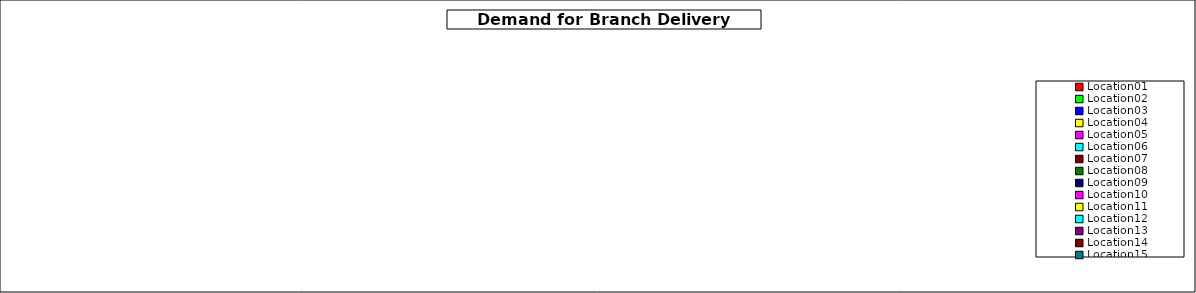
| Category | Data A |
|---|---|
| Location01 | 0 |
| Location02 | 0 |
| Location03 | 0 |
| Location04 | 0 |
| Location05 | 0 |
| Location06 | 0 |
| Location07 | 0 |
| Location08 | 0 |
| Location09 | 0 |
| Location10 | 0 |
| Location11 | 0 |
| Location12 | 0 |
| Location13 | 0 |
| Location14 | 0 |
| Location15 | 0 |